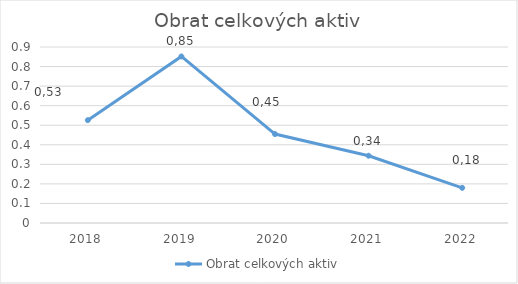
| Category | Obrat celkových aktiv |
|---|---|
| 2018.0 | 0.526 |
| 2019.0 | 0.852 |
| 2020.0 | 0.455 |
| 2021.0 | 0.344 |
| 2022.0 | 0.18 |